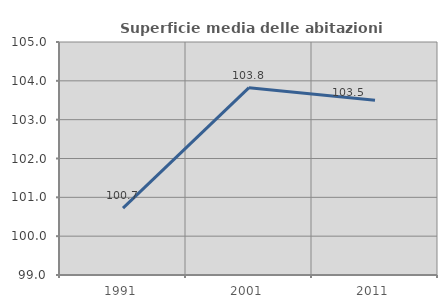
| Category | Superficie media delle abitazioni occupate |
|---|---|
| 1991.0 | 100.724 |
| 2001.0 | 103.825 |
| 2011.0 | 103.498 |